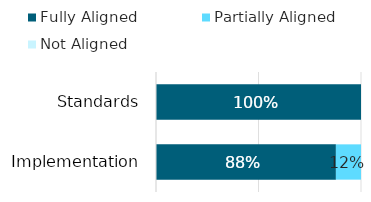
| Category | Fully Aligned | Partially Aligned | Not Aligned |
|---|---|---|---|
| Standards | 1 | 0 | 0 |
| Implementation | 0.878 | 0.122 | 0 |